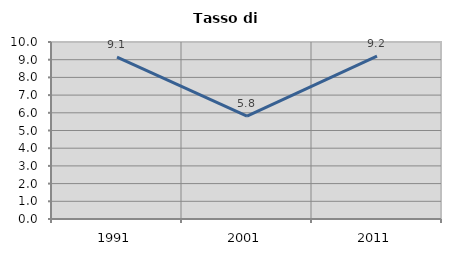
| Category | Tasso di disoccupazione   |
|---|---|
| 1991.0 | 9.149 |
| 2001.0 | 5.806 |
| 2011.0 | 9.197 |